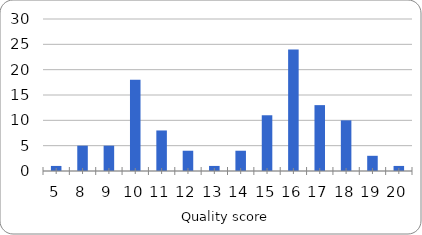
| Category | Series 0 |
|---|---|
| 5.0 | 1 |
| 8.0 | 5 |
| 9.0 | 5 |
| 10.0 | 18 |
| 11.0 | 8 |
| 12.0 | 4 |
| 13.0 | 1 |
| 14.0 | 4 |
| 15.0 | 11 |
| 16.0 | 24 |
| 17.0 | 13 |
| 18.0 | 10 |
| 19.0 | 3 |
| 20.0 | 1 |